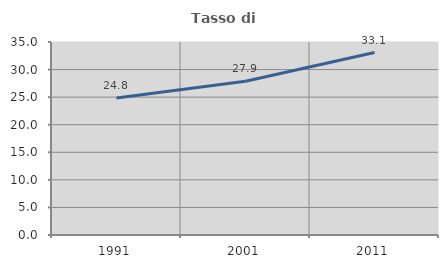
| Category | Tasso di occupazione   |
|---|---|
| 1991.0 | 24.831 |
| 2001.0 | 27.898 |
| 2011.0 | 33.091 |